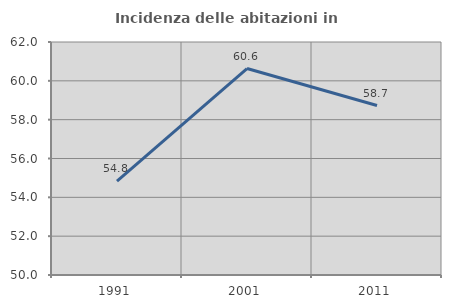
| Category | Incidenza delle abitazioni in proprietà  |
|---|---|
| 1991.0 | 54.829 |
| 2001.0 | 60.634 |
| 2011.0 | 58.728 |